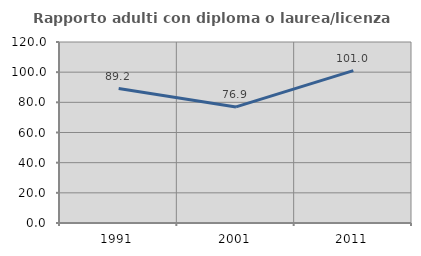
| Category | Rapporto adulti con diploma o laurea/licenza media  |
|---|---|
| 1991.0 | 89.167 |
| 2001.0 | 76.948 |
| 2011.0 | 101.017 |